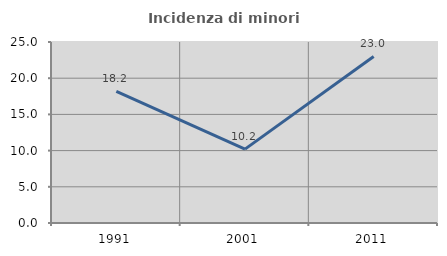
| Category | Incidenza di minori stranieri |
|---|---|
| 1991.0 | 18.182 |
| 2001.0 | 10.204 |
| 2011.0 | 23.005 |